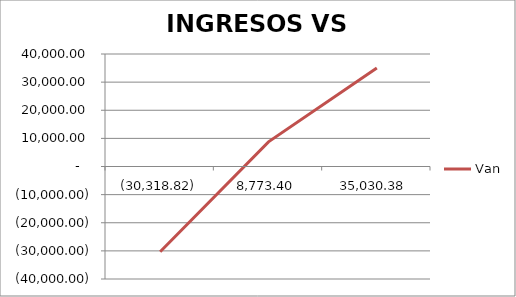
| Category | Van |
|---|---|
| -30318.824826180266 | -30318.825 |
| 8773.404346133284 | 8773.404 |
| 35030.38379574536 | 35030.384 |